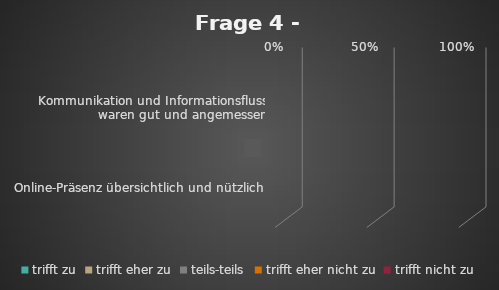
| Category | trifft zu | trifft eher zu | teils-teils | trifft eher nicht zu | trifft nicht zu |
|---|---|---|---|---|---|
| Kommunikation und Informationsfluss waren gut und angemessen | 0 | 0 | 0 | 0 | 0 |
| Online-Präsenz übersichtlich und nützlich | 0 | 0 | 0 | 0 | 0 |